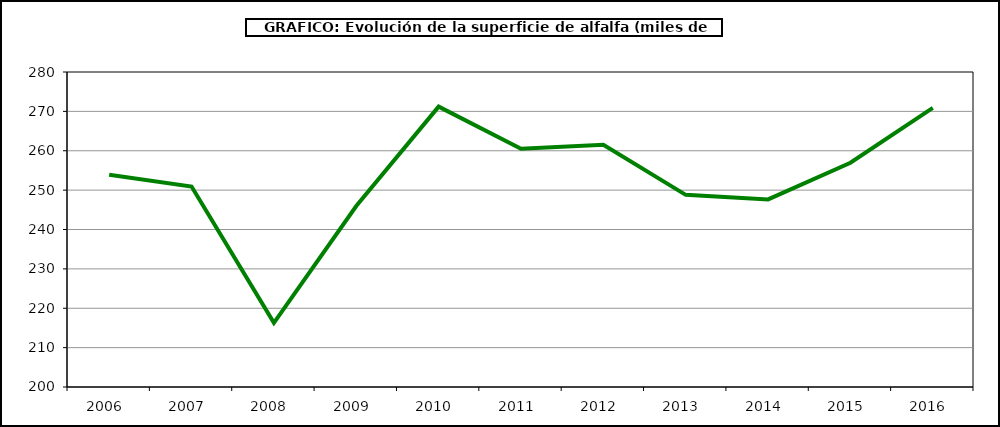
| Category | Superficie |
|---|---|
| 2006.0 | 253.883 |
| 2007.0 | 250.925 |
| 2008.0 | 216.281 |
| 2009.0 | 245.966 |
| 2010.0 | 271.204 |
| 2011.0 | 260.531 |
| 2012.0 | 261.526 |
| 2013.0 | 248.801 |
| 2014.0 | 247.639 |
| 2015.0 | 256.952 |
| 2016.0 | 270.874 |